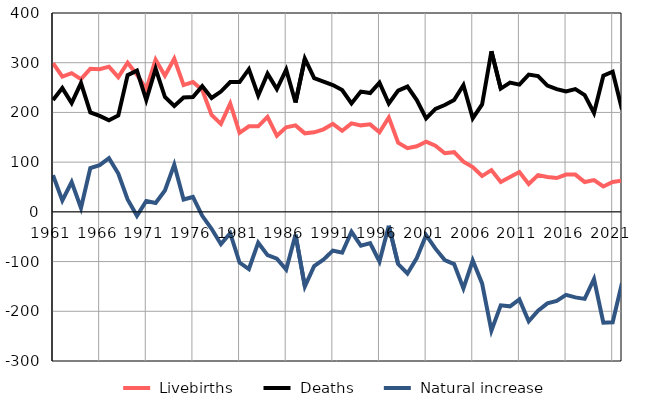
| Category |  Livebirths |  Deaths |  Natural increase |
|---|---|---|---|
| 1961.0 | 299 | 225 | 74 |
| 1962.0 | 272 | 249 | 23 |
| 1963.0 | 279 | 219 | 60 |
| 1964.0 | 267 | 259 | 8 |
| 1965.0 | 288 | 200 | 88 |
| 1966.0 | 287 | 193 | 94 |
| 1967.0 | 292 | 184 | 108 |
| 1968.0 | 271 | 194 | 77 |
| 1969.0 | 300 | 275 | 25 |
| 1970.0 | 276 | 284 | -8 |
| 1971.0 | 247 | 225 | 22 |
| 1972.0 | 306 | 288 | 18 |
| 1973.0 | 274 | 231 | 43 |
| 1974.0 | 308 | 213 | 95 |
| 1975.0 | 255 | 230 | 25 |
| 1976.0 | 261 | 231 | 30 |
| 1977.0 | 245 | 253 | -8 |
| 1978.0 | 195 | 229 | -34 |
| 1979.0 | 177 | 242 | -65 |
| 1980.0 | 218 | 261 | -43 |
| 1981.0 | 159 | 261 | -102 |
| 1982.0 | 172 | 287 | -115 |
| 1983.0 | 172 | 234 | -62 |
| 1984.0 | 191 | 278 | -87 |
| 1985.0 | 153 | 247 | -94 |
| 1986.0 | 170 | 286 | -116 |
| 1987.0 | 174 | 220 | -46 |
| 1988.0 | 158 | 308 | -150 |
| 1989.0 | 160 | 269 | -109 |
| 1990.0 | 166 | 262 | -96 |
| 1991.0 | 177 | 255 | -78 |
| 1992.0 | 163 | 245 | -82 |
| 1993.0 | 178 | 218 | -40 |
| 1994.0 | 174 | 242 | -68 |
| 1995.0 | 176 | 239 | -63 |
| 1996.0 | 160 | 260 | -100 |
| 1997.0 | 190 | 218 | -28 |
| 1998.0 | 139 | 244 | -105 |
| 1999.0 | 128 | 252 | -124 |
| 2000.0 | 132 | 225 | -93 |
| 2001.0 | 141 | 188 | -47 |
| 2002.0 | 133 | 207 | -74 |
| 2003.0 | 118 | 215 | -97 |
| 2004.0 | 120 | 225 | -105 |
| 2005.0 | 101 | 255 | -154 |
| 2006.0 | 90 | 188 | -98 |
| 2007.0 | 72 | 216 | -144 |
| 2008.0 | 84 | 323 | -239 |
| 2009.0 | 60 | 248 | -188 |
| 2010.0 | 70 | 260 | -190 |
| 2011.0 | 80 | 256 | -176 |
| 2012.0 | 56 | 276 | -220 |
| 2013.0 | 74 | 273 | -199 |
| 2014.0 | 70 | 254 | -184 |
| 2015.0 | 68 | 247 | -179 |
| 2016.0 | 75 | 242 | -167 |
| 2017.0 | 75 | 247 | -172 |
| 2018.0 | 60 | 235 | -175 |
| 2019.0 | 64 | 199 | -135 |
| 2020.0 | 51 | 274 | -223 |
| 2021.0 | 60 | 282 | -222 |
| 2022.0 | 63 | 206 | -143 |